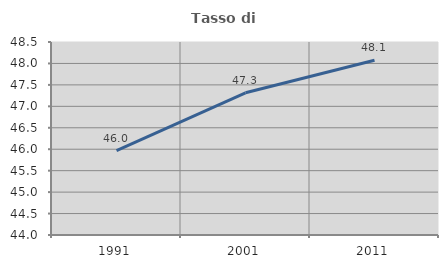
| Category | Tasso di occupazione   |
|---|---|
| 1991.0 | 45.969 |
| 2001.0 | 47.315 |
| 2011.0 | 48.076 |